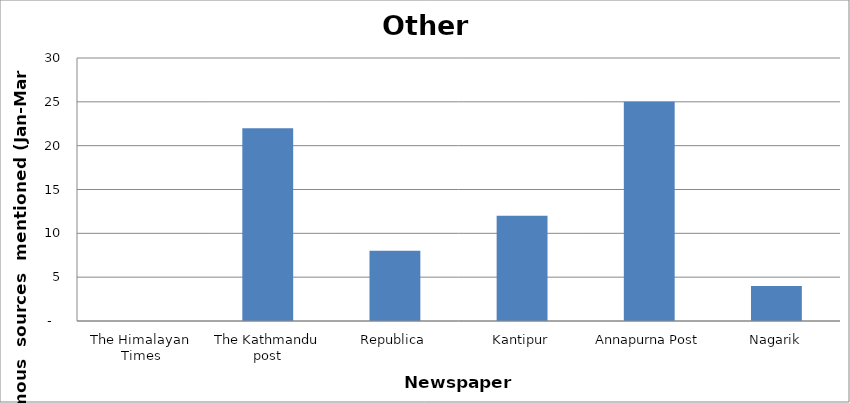
| Category | Others |
|---|---|
| The Himalayan Times | 0 |
| The Kathmandu post | 22 |
| Republica | 8 |
| Kantipur | 12 |
| Annapurna Post | 25 |
| Nagarik | 4 |